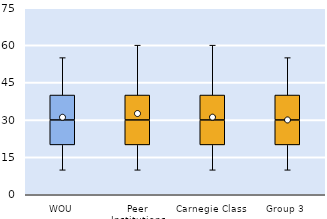
| Category | 25th | 50th | 75th |
|---|---|---|---|
| WOU | 20 | 10 | 10 |
| Peer Institutions | 20 | 10 | 10 |
| Carnegie Class | 20 | 10 | 10 |
| Group 3 | 20 | 10 | 10 |